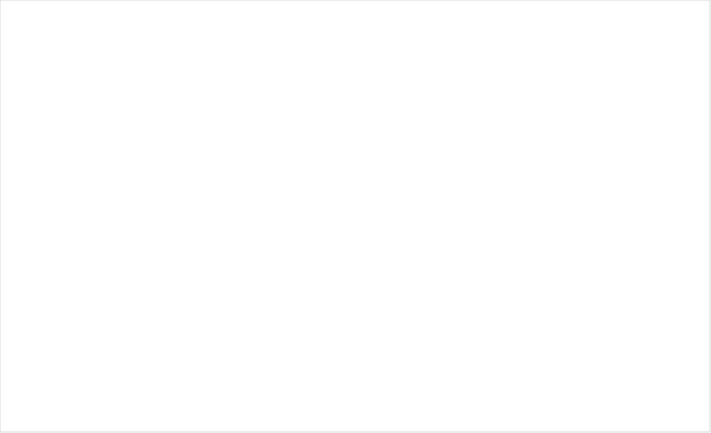
| Category | 6111 - Elementary and secondary schools - Labor Productivity - Public Schools - 1992=100 | 6111 - Elementary and secondary schools - Labor Productivity - Private Schools - 1992=100 | 6111 - Elementary and secondary schools - Labor Productivity - All Schools - 1992=100 |
|---|---|---|---|
| 1992 | 100 | 100 | 100 |
| 1993 | 99.553 | 104.494 | 99.928 |
| 1994 | 98.981 | 103.021 | 99.29 |
| 1995 | 99.278 | 101.367 | 99.441 |
| 1996 | 99.279 | 97.764 | 99.167 |
| 1997 | 97.163 | 95.022 | 97.003 |
| 1998 | 95.281 | 92.872 | 95.1 |
| 1999 | 93.235 | 91.313 | 93.091 |
| 2000 | 92.857 | 92.291 | 92.817 |
| 2001 | 91.46 | 93.535 | 91.622 |
| 2002 | 92.045 | 90.894 | 91.959 |
| 2003 | 92.699 | 88.363 | 92.361 |
| 2004 | 92.02 | 86.291 | 91.57 |
| 2005 | 91.757 | 84.241 | 91.161 |
| 2006 | 91.845 | 81.136 | 90.982 |
| 2007 | 90.788 | 78.224 | 89.764 |
| 2008 | 90.144 | 77.127 | 89.081 |
| 2009 | 89.614 | 75.291 | 88.439 |
| 2010 | 92.792 | 75.327 | 91.346 |
| 2011 | 94.149 | 75.524 | 92.601 |
| 2012 | 93.933 | 77.442 | 92.573 |
| 2013 | 94.406 | 79.456 | 93.182 |
| 2014 | 93.925 | 83.121 | 93.056 |